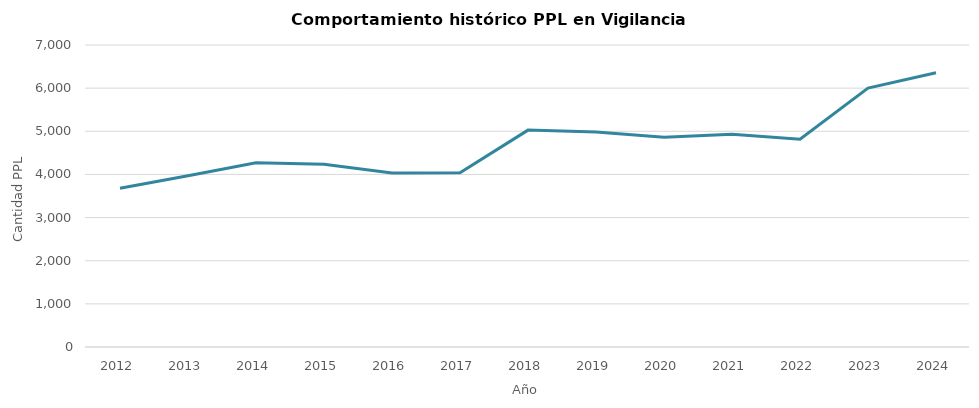
| Category | Promedio anual Vigilancia Electronica |
|---|---|
| 2012.0 | 3681.25 |
| 2013.0 | 3969.167 |
| 2014.0 | 4270.833 |
| 2015.0 | 4235.667 |
| 2016.0 | 4035.917 |
| 2017.0 | 4037.5 |
| 2018.0 | 5027.25 |
| 2019.0 | 4984.25 |
| 2020.0 | 4861 |
| 2021.0 | 4932.083 |
| 2022.0 | 4814.083 |
| 2023.0 | 6001.5 |
| 2024.0 | 6355.667 |